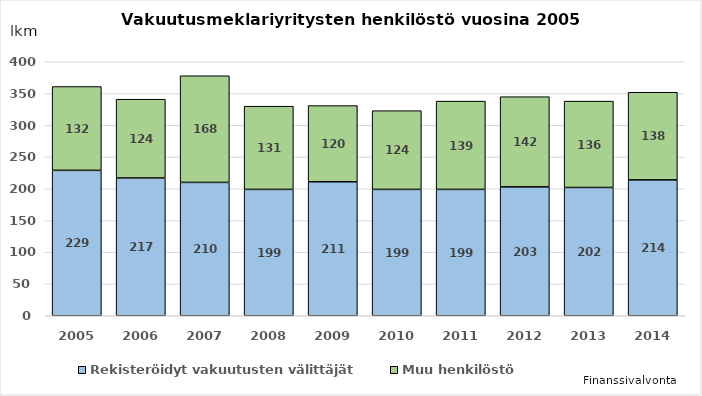
| Category | Rekisteröidyt vakuutusten välittäjät  | Muu henkilöstö |
|---|---|---|
| 2005.0 | 229 | 132 |
| 2006.0 | 217 | 124 |
| 2007.0 | 210 | 168 |
| 2008.0 | 199 | 131 |
| 2009.0 | 211 | 120 |
| 2010.0 | 199 | 124 |
| 2011.0 | 199 | 139 |
| 2012.0 | 203 | 142 |
| 2013.0 | 202 | 136 |
| 2014.0 | 214 | 138 |